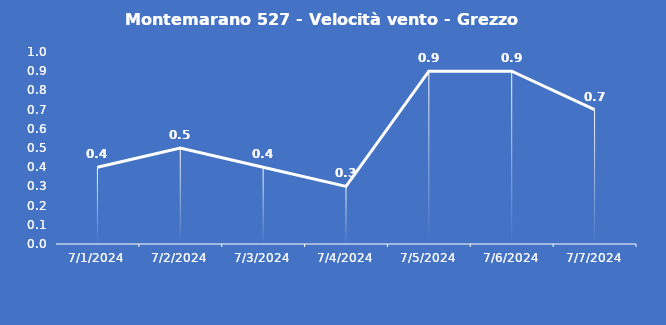
| Category | Montemarano 527 - Velocità vento - Grezzo (m/s) |
|---|---|
| 7/1/24 | 0.4 |
| 7/2/24 | 0.5 |
| 7/3/24 | 0.4 |
| 7/4/24 | 0.3 |
| 7/5/24 | 0.9 |
| 7/6/24 | 0.9 |
| 7/7/24 | 0.7 |